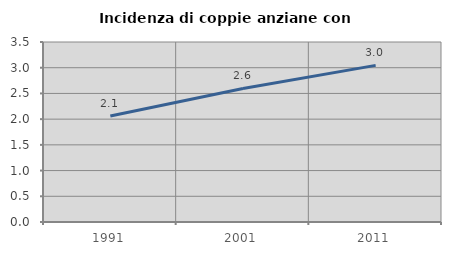
| Category | Incidenza di coppie anziane con figli |
|---|---|
| 1991.0 | 2.062 |
| 2001.0 | 2.597 |
| 2011.0 | 3.046 |